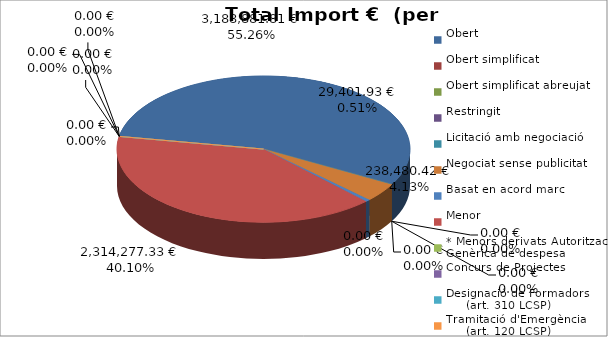
| Category | Total preu
(amb IVA) |
|---|---|
| Obert | 3188881.81 |
| Obert simplificat | 0 |
| Obert simplificat abreujat | 0 |
| Restringit | 0 |
| Licitació amb negociació | 0 |
| Negociat sense publicitat | 238480.42 |
| Basat en acord marc | 29401.93 |
| Menor | 2314277.33 |
| * Menors derivats Autorització Genèrica de despesa | 0 |
| Concurs de Projectes | 0 |
| Designació de Formadors
     (art. 310 LCSP) | 0 |
| Tramitació d'Emergència
     (art. 120 LCSP) | 0 |